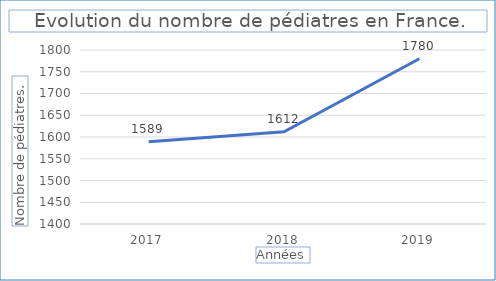
| Category | Pédiatres |
|---|---|
| 2017.0 | 1589 |
| 2018.0 | 1612 |
| 2019.0 | 1780 |